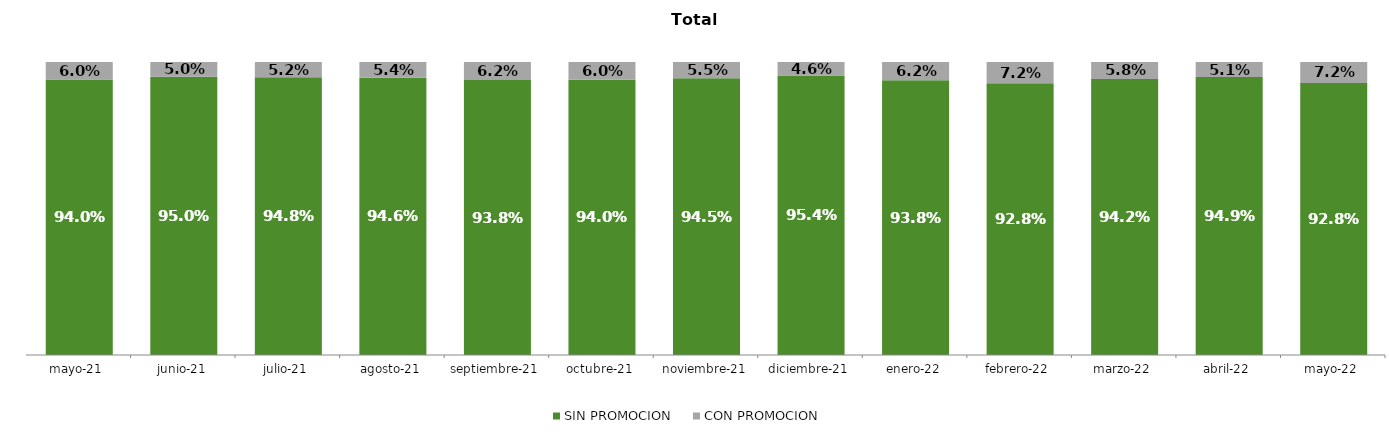
| Category | SIN PROMOCION   | CON PROMOCION   |
|---|---|---|
| 2021-05-01 | 0.94 | 0.06 |
| 2021-06-01 | 0.95 | 0.05 |
| 2021-07-01 | 0.948 | 0.052 |
| 2021-08-01 | 0.946 | 0.054 |
| 2021-09-01 | 0.938 | 0.062 |
| 2021-10-01 | 0.94 | 0.06 |
| 2021-11-01 | 0.945 | 0.055 |
| 2021-12-01 | 0.954 | 0.046 |
| 2022-01-01 | 0.938 | 0.062 |
| 2022-02-01 | 0.928 | 0.072 |
| 2022-03-01 | 0.942 | 0.058 |
| 2022-04-01 | 0.949 | 0.051 |
| 2022-05-01 | 0.928 | 0.072 |